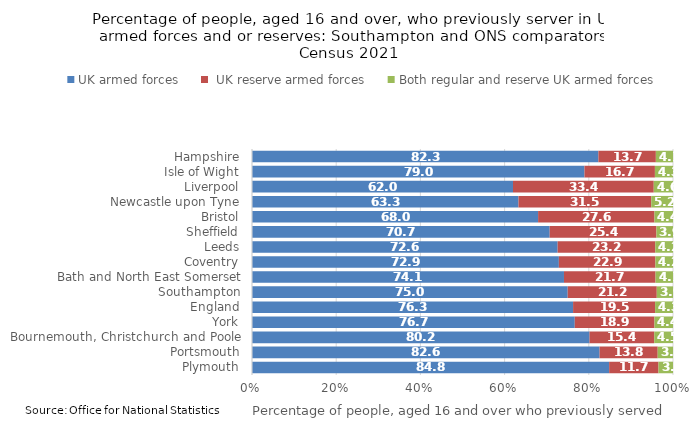
| Category | UK armed forces |  UK reserve armed forces | Both regular and reserve UK armed forces |
|---|---|---|---|
| Plymouth | 84.835 | 11.724 | 3.441 |
| Portsmouth | 82.561 | 13.807 | 3.632 |
| Bournemouth, Christchurch and Poole | 80.175 | 15.371 | 4.455 |
| York | 76.666 | 18.933 | 4.401 |
| England | 76.267 | 19.48 | 4.253 |
| Southampton | 74.988 | 21.16 | 3.852 |
| Bath and North East Somerset | 74.104 | 21.748 | 4.148 |
| Coventry | 72.889 | 22.932 | 4.179 |
| Leeds | 72.599 | 23.185 | 4.215 |
| Sheffield | 70.71 | 25.357 | 3.933 |
| Bristol | 67.959 | 27.637 | 4.404 |
| Newcastle upon Tyne | 63.296 | 31.538 | 5.166 |
| Liverpool | 61.995 | 33.434 | 4.571 |
| Isle of Wight | 78.969 | 16.736 | 4.295 |
| Hampshire | 82.278 | 13.652 | 4.07 |